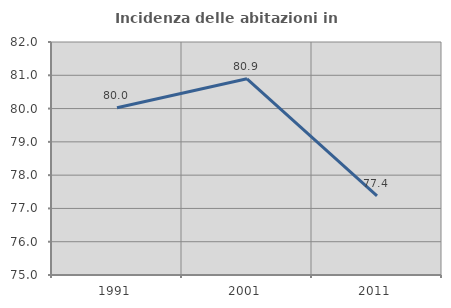
| Category | Incidenza delle abitazioni in proprietà  |
|---|---|
| 1991.0 | 80.023 |
| 2001.0 | 80.894 |
| 2011.0 | 77.376 |